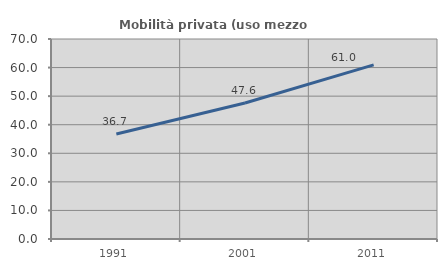
| Category | Mobilità privata (uso mezzo privato) |
|---|---|
| 1991.0 | 36.741 |
| 2001.0 | 47.619 |
| 2011.0 | 60.961 |